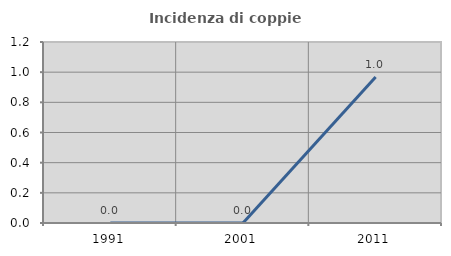
| Category | Incidenza di coppie miste |
|---|---|
| 1991.0 | 0 |
| 2001.0 | 0 |
| 2011.0 | 0.968 |